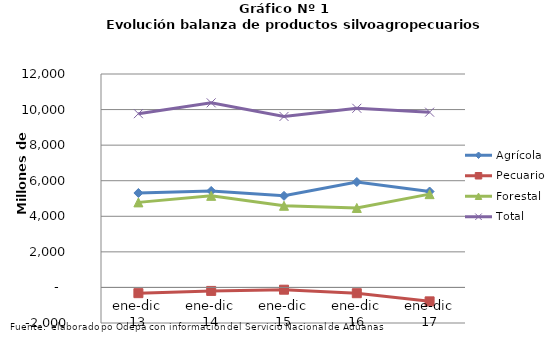
| Category | Agrícola | Pecuario | Forestal | Total |
|---|---|---|---|---|
| ene-dic 13 | 5309603 | -322473 | 4781973 | 9769103 |
| ene-dic 14 | 5424524 | -195643 | 5149868 | 10378749 |
| ene-dic 15 | 5149872 | -127785 | 4591408 | 9613495 |
| ene-dic 16 | 5929397 | -325027 | 4468126 | 10072496 |
| ene-dic 17 | 5393158 | -783290 | 5244611 | 9854479 |